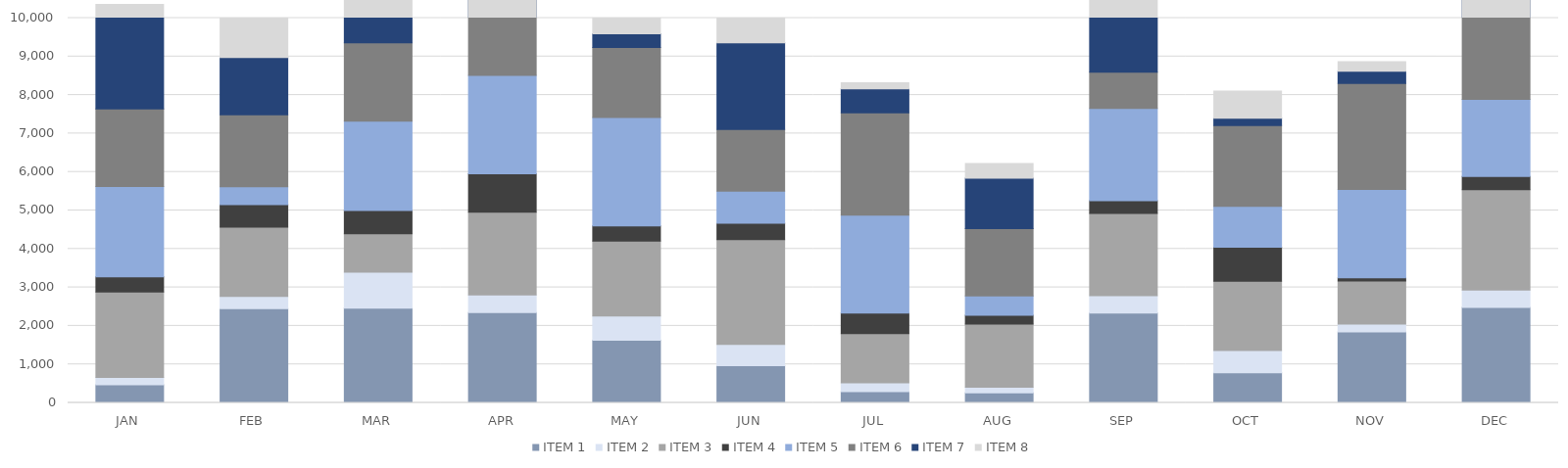
| Category | ITEM 1 | ITEM 2 | ITEM 3 | ITEM 4 | ITEM 5 | ITEM 6 | ITEM 7 | ITEM 8 |
|---|---|---|---|---|---|---|---|---|
| JAN | 472 | 191 | 2220 | 394 | 2347 | 2014 | 2741 | 821 |
| FEB | 2447 | 320 | 1800 | 586 | 466 | 1869 | 1490 | 2040 |
| MAR | 2465 | 931 | 999 | 606 | 2323 | 2035 | 2607 | 447 |
| APR | 2350 | 458 | 2150 | 994 | 2559 | 2344 | 1077 | 1002 |
| MAY | 1628 | 628 | 1952 | 390 | 2822 | 1818 | 357 | 1153 |
| JUN | 965 | 555 | 2722 | 426 | 836 | 1601 | 2254 | 1457 |
| JUL | 292 | 229 | 1281 | 531 | 2545 | 2663 | 620 | 157 |
| AUG | 259 | 150 | 1639 | 230 | 504 | 1750 | 1308 | 379 |
| SEP | 2333 | 453 | 2139 | 331 | 2396 | 944 | 1946 | 384 |
| OCT | 784 | 577 | 1801 | 883 | 1064 | 2097 | 194 | 703 |
| NOV | 1847 | 201 | 1118 | 84 | 2295 | 2755 | 318 | 250 |
| DEC | 2482 | 452 | 2604 | 347 | 2006 | 2687 | 319 | 675 |